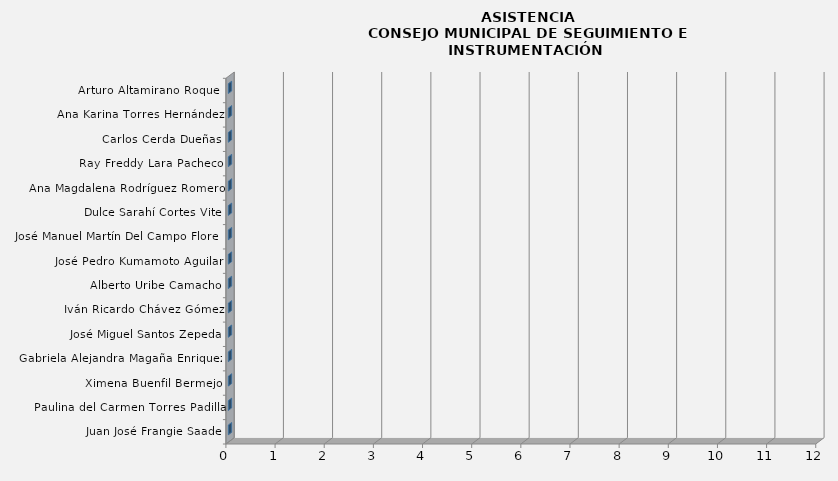
| Category | Series 0 |
|---|---|
| Juan José Frangie Saade | 0 |
| Paulina del Carmen Torres Padilla | 0 |
| Ximena Buenfil Bermejo | 0 |
| Gabriela Alejandra Magaña Enriquez | 0 |
| José Miguel Santos Zepeda | 0 |
| Iván Ricardo Chávez Gómez | 0 |
| Alberto Uribe Camacho | 0 |
| José Pedro Kumamoto Aguilar | 0 |
| José Manuel Martín Del Campo Flores | 0 |
| Dulce Sarahí Cortes Vite | 0 |
| Ana Magdalena Rodríguez Romero | 0 |
| Ray Freddy Lara Pacheco | 0 |
| Carlos Cerda Dueñas | 0 |
| Ana Karina Torres Hernández | 0 |
| Arturo Altamirano Roque  | 0 |